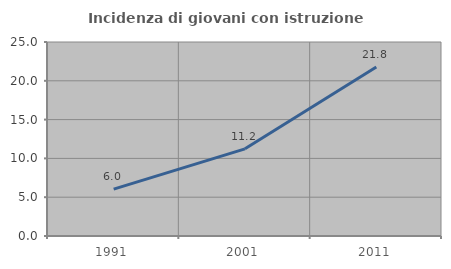
| Category | Incidenza di giovani con istruzione universitaria |
|---|---|
| 1991.0 | 6.038 |
| 2001.0 | 11.233 |
| 2011.0 | 21.79 |